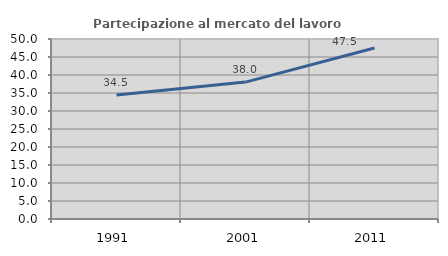
| Category | Partecipazione al mercato del lavoro  femminile |
|---|---|
| 1991.0 | 34.471 |
| 2001.0 | 38.033 |
| 2011.0 | 47.482 |